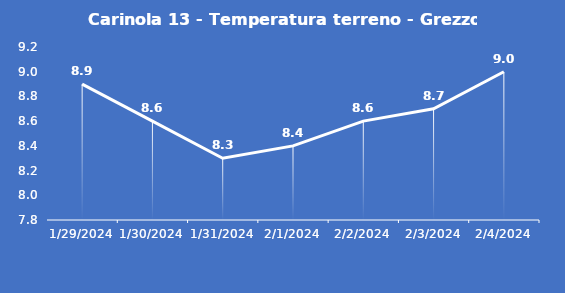
| Category | Carinola 13 - Temperatura terreno - Grezzo (°C) |
|---|---|
| 1/29/24 | 8.9 |
| 1/30/24 | 8.6 |
| 1/31/24 | 8.3 |
| 2/1/24 | 8.4 |
| 2/2/24 | 8.6 |
| 2/3/24 | 8.7 |
| 2/4/24 | 9 |